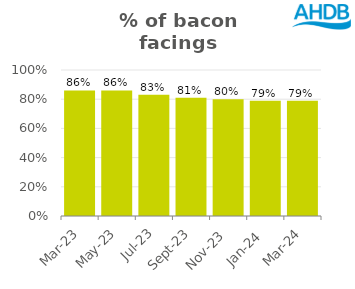
| Category | Bacon |
|---|---|
| 2023-03-01 | 0.86 |
| 2023-05-01 | 0.86 |
| 2023-07-01 | 0.83 |
| 2023-09-01 | 0.81 |
| 2023-11-01 | 0.8 |
| 2024-01-01 | 0.79 |
| 2024-03-01 | 0.79 |